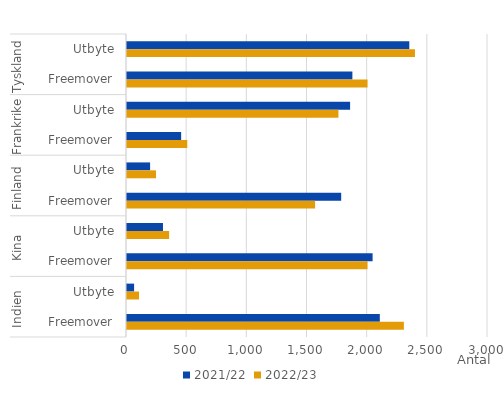
| Category | 2021/22 | 2022/23 |
|---|---|---|
| 0 | 2346 | 2393 |
| 1 | 1873 | 1999 |
| 2 | 1854 | 1757 |
| 3 | 450 | 501 |
| 4 | 192 | 241 |
| 5 | 1780 | 1563 |
| 6 | 299 | 350 |
| 7 | 2041 | 1999 |
| 8 | 59 | 100 |
| 9 | 2101 | 2301 |